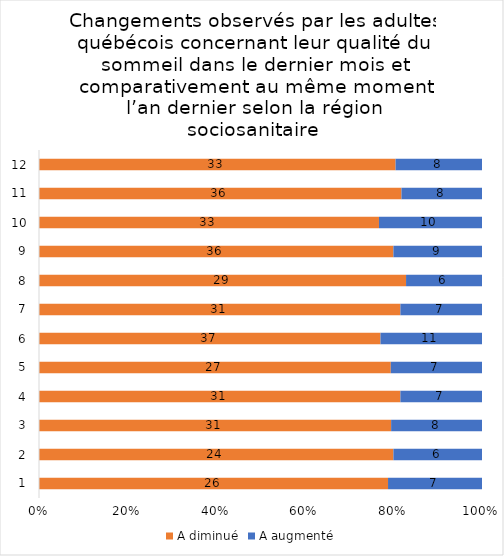
| Category | A diminué | A augmenté |
|---|---|---|
| 0 | 26 | 7 |
| 1 | 24 | 6 |
| 2 | 31 | 8 |
| 3 | 31 | 7 |
| 4 | 27 | 7 |
| 5 | 37 | 11 |
| 6 | 31 | 7 |
| 7 | 29 | 6 |
| 8 | 36 | 9 |
| 9 | 33 | 10 |
| 10 | 36 | 8 |
| 11 | 33 | 8 |